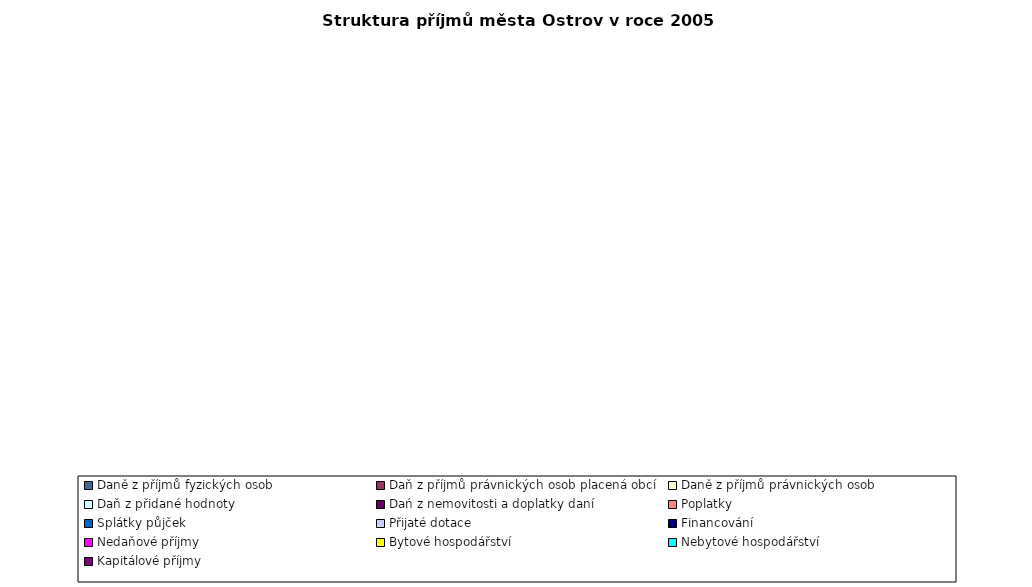
| Category | Series 0 |
|---|---|
| Daně z příjmů fyzických osob | 0 |
| Daň z příjmů právnických osob placená obcí | 0 |
| Daně z příjmů právnických osob | 0 |
| Daň z přidané hodnoty | 0 |
| Dań z nemovitosti a doplatky daní | 0 |
| Poplatky  | 0 |
| Splátky půjček | 0 |
| Přijaté dotace | 0 |
| Financování | 0 |
| Nedaňové příjmy | 0 |
| Bytové hospodářství | 0 |
| Nebytové hospodářství | 0 |
| Kapitálové příjmy | 0 |